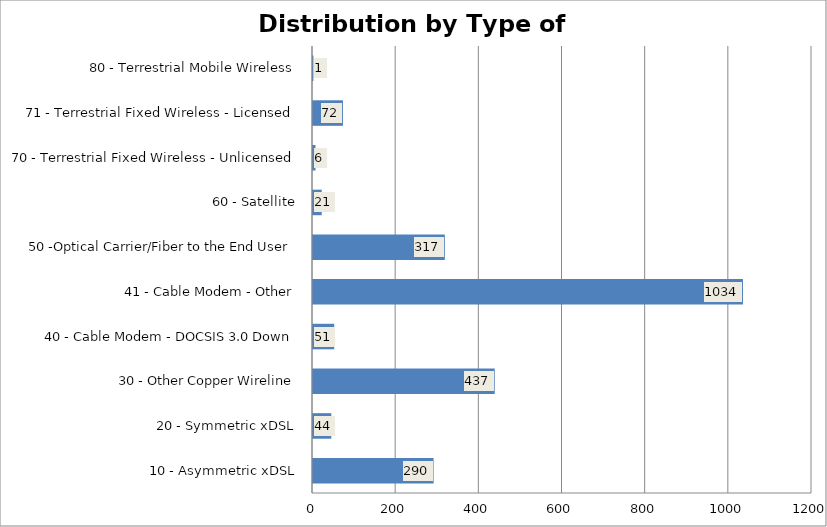
| Category | Count |
|---|---|
| 10 - Asymmetric xDSL | 290 |
| 20 - Symmetric xDSL | 44 |
| 30 - Other Copper Wireline | 437 |
| 40 - Cable Modem - DOCSIS 3.0 Down | 51 |
| 41 - Cable Modem - Other | 1034 |
| 50 -Optical Carrier/Fiber to the End User | 317 |
| 60 - Satellite | 21 |
| 70 - Terrestrial Fixed Wireless - Unlicensed | 6 |
| 71 - Terrestrial Fixed Wireless - Licensed | 72 |
| 80 - Terrestrial Mobile Wireless | 1 |